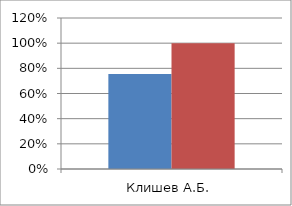
| Category | Series 0 | 2 |
|---|---|---|
| Клишев А.Б. | 0.754 | 1 |